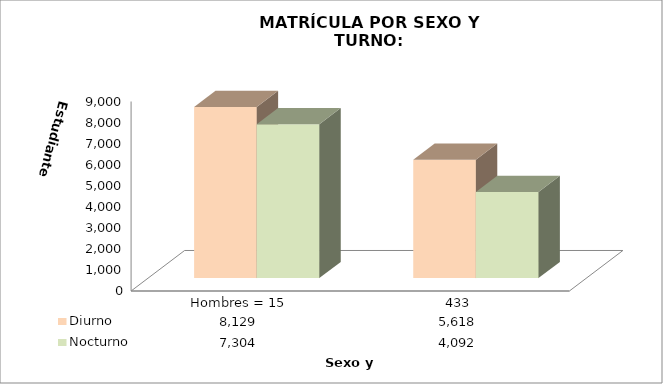
| Category | Diurno | Nocturno |
|---|---|---|
| 0 | 8129 | 7304 |
| 1 | 5618 | 4092 |